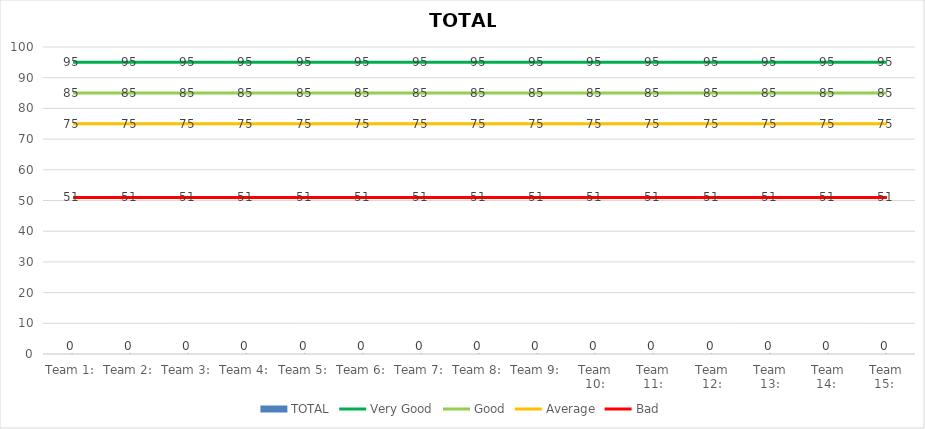
| Category | TOTAL |
|---|---|
| Team 1: | 0 |
| Team 2: | 0 |
| Team 3: | 0 |
| Team 4: | 0 |
| Team 5: | 0 |
| Team 6: | 0 |
| Team 7: | 0 |
| Team 8: | 0 |
| Team 9: | 0 |
| Team 10: | 0 |
| Team 11: | 0 |
| Team 12: | 0 |
| Team 13: | 0 |
| Team 14:  | 0 |
| Team 15:  | 0 |